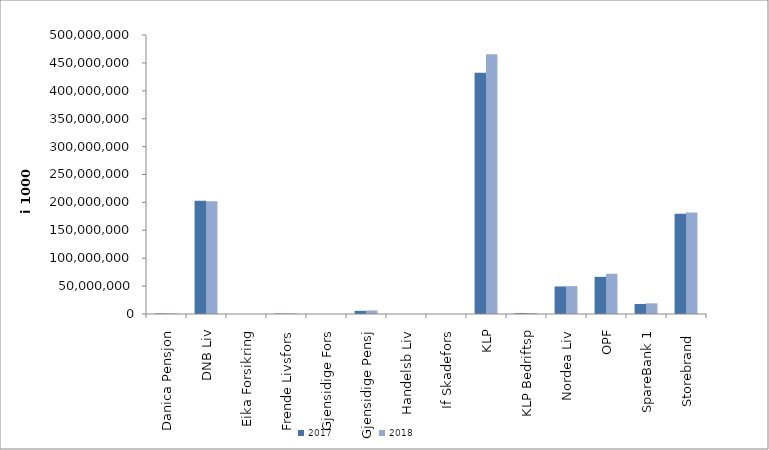
| Category | 2017 | 2018 |
|---|---|---|
| Danica Pensjon | 981728.211 | 1062443.889 |
| DNB Liv | 203085268 | 201995081 |
| Eika Forsikring | 0 | 0 |
| Frende Livsfors | 859744 | 913292 |
| Gjensidige Fors | 0 | 0 |
| Gjensidige Pensj | 5705784 | 6339478 |
| Handelsb Liv | 27134 | 22086 |
| If Skadefors | 0 | 0 |
| KLP | 432230923.249 | 465567937.942 |
| KLP Bedriftsp | 1534741 | 1675895 |
| Nordea Liv | 49326980 | 49965830 |
| OPF | 66551653 | 72102299 |
| SpareBank 1 | 18002122.575 | 19103233.846 |
| Storebrand  | 179546571.703 | 181759928.142 |